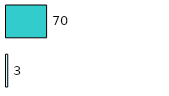
| Category | Series 0 | Series 1 |
|---|---|---|
| 0 | 3 | 70 |